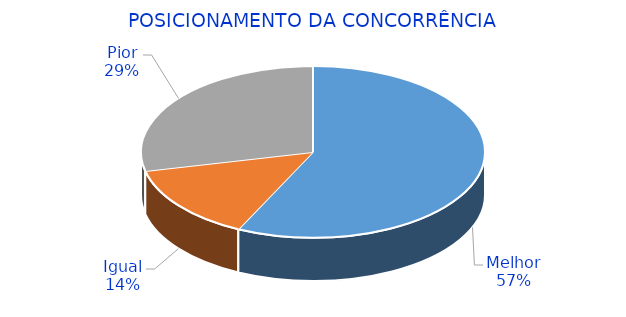
| Category | Series 0 |
|---|---|
| Melhor | 4 |
| Igual | 1 |
| Pior | 2 |